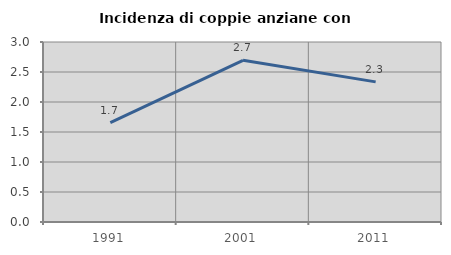
| Category | Incidenza di coppie anziane con figli |
|---|---|
| 1991.0 | 1.656 |
| 2001.0 | 2.695 |
| 2011.0 | 2.336 |